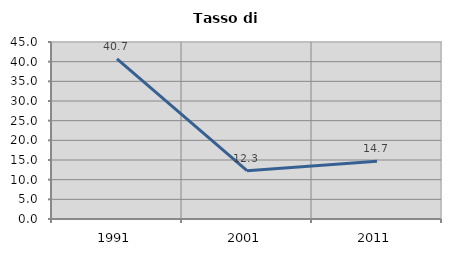
| Category | Tasso di disoccupazione   |
|---|---|
| 1991.0 | 40.688 |
| 2001.0 | 12.272 |
| 2011.0 | 14.706 |